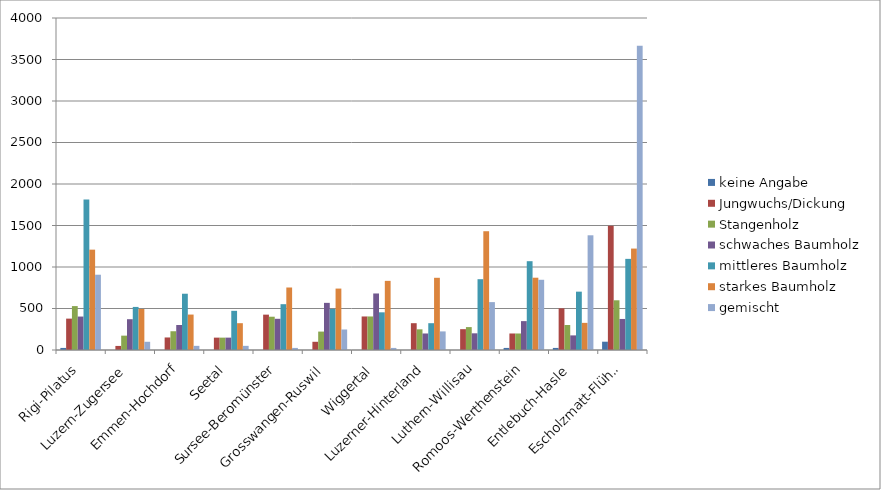
| Category | keine Angabe | Jungwuchs/Dickung | Stangenholz | schwaches Baumholz | mittleres Baumholz | starkes Baumholz | gemischt |
|---|---|---|---|---|---|---|---|
| Rigi-Pilatus | 25 | 378 | 529 | 403 | 1813 | 1209 | 907 |
| Luzern-Zugersee | 0 | 49 | 173 | 371 | 519 | 494 | 99 |
| Emmen-Hochdorf | 0 | 151 | 226 | 301 | 678 | 427 | 50 |
| Seetal | 0 | 149 | 149 | 149 | 472 | 323 | 50 |
| Sursee-Beromünster | 0 | 426 | 401 | 376 | 552 | 753 | 25 |
| Grosswangen-Ruswil | 0 | 99 | 222 | 568 | 494 | 740 | 247 |
| Wiggertal | 0 | 404 | 404 | 681 | 454 | 833 | 25 |
| Luzerner-Hinterland | 0 | 323 | 249 | 199 | 323 | 870 | 224 |
| Luthern-Willisau | 0 | 251 | 276 | 201 | 853 | 1431 | 577 |
| Romoos-Werthenstein | 25 | 199 | 199 | 348 | 1070 | 871 | 846 |
| Entlebuch-Hasle | 25 | 502 | 301 | 176 | 703 | 327 | 1382 |
| Escholzmatt-Flühli | 100 | 1497 | 599 | 374 | 1098 | 1222 | 3667 |